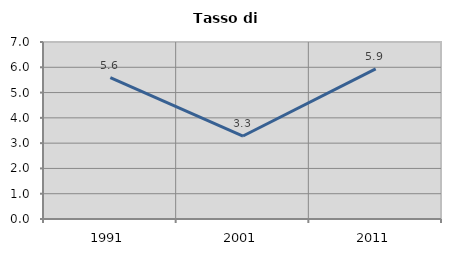
| Category | Tasso di disoccupazione   |
|---|---|
| 1991.0 | 5.587 |
| 2001.0 | 3.282 |
| 2011.0 | 5.936 |